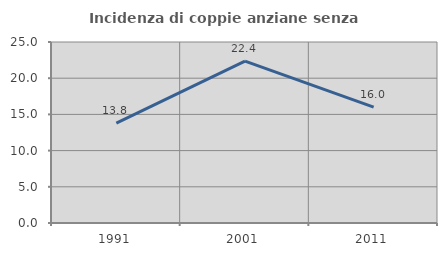
| Category | Incidenza di coppie anziane senza figli  |
|---|---|
| 1991.0 | 13.793 |
| 2001.0 | 22.353 |
| 2011.0 | 16 |